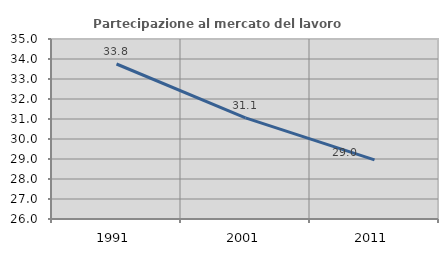
| Category | Partecipazione al mercato del lavoro  femminile |
|---|---|
| 1991.0 | 33.75 |
| 2001.0 | 31.054 |
| 2011.0 | 28.956 |